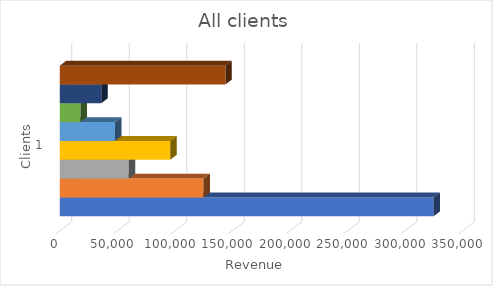
| Category | NASF - GR | NASF- MG | NASF - ED | Poultry-E | Poultry-S | Turkey | AFIA | Nickel |
|---|---|---|---|---|---|---|---|---|
| 0 | 325000 | 125000 | 60000 | 96000 | 48000 | 18000 | 36000 | 144000 |